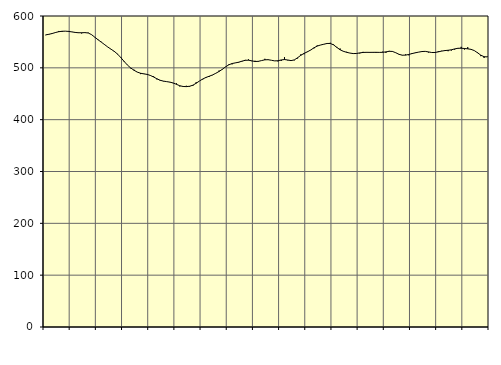
| Category | Piggar | Series 1 |
|---|---|---|
| nan | 563 | 563.58 |
| 87.0 | 565.1 | 564.72 |
| 87.0 | 565.5 | 566.22 |
| 87.0 | 567.5 | 568.09 |
| nan | 571.1 | 569.68 |
| 88.0 | 569.2 | 570.53 |
| 88.0 | 570.7 | 570.74 |
| 88.0 | 571.1 | 570.26 |
| nan | 569.1 | 569.36 |
| 89.0 | 568.6 | 568.34 |
| 89.0 | 568.3 | 567.7 |
| 89.0 | 566.3 | 567.71 |
| nan | 568.4 | 567.95 |
| 90.0 | 567.9 | 567.22 |
| 90.0 | 564.4 | 564.16 |
| 90.0 | 558.9 | 559.25 |
| nan | 553.6 | 554.25 |
| 91.0 | 550.2 | 549.6 |
| 91.0 | 545.5 | 544.87 |
| 91.0 | 540.1 | 540.17 |
| nan | 536.1 | 535.91 |
| 92.0 | 530.5 | 531.68 |
| 92.0 | 527 | 526.33 |
| 92.0 | 520.4 | 519.63 |
| nan | 511.3 | 512.28 |
| 93.0 | 505.6 | 505.3 |
| 93.0 | 499.1 | 499.74 |
| 93.0 | 496.4 | 495.35 |
| nan | 491.6 | 491.84 |
| 94.0 | 487.9 | 489.57 |
| 94.0 | 488.9 | 488.36 |
| 94.0 | 487.1 | 487.36 |
| nan | 484.8 | 485.33 |
| 95.0 | 483.7 | 482.29 |
| 95.0 | 477.7 | 478.91 |
| 95.0 | 475.1 | 476 |
| nan | 473.9 | 474.36 |
| 96.0 | 473.2 | 473.39 |
| 96.0 | 472.1 | 472.38 |
| 96.0 | 470.3 | 470.75 |
| nan | 470 | 468.12 |
| 97.0 | 464.1 | 465.45 |
| 97.0 | 463.6 | 464.02 |
| 97.0 | 465.4 | 463.77 |
| nan | 463.5 | 464.46 |
| 98.0 | 465.1 | 466.51 |
| 98.0 | 472.2 | 470.24 |
| 98.0 | 474.5 | 474.53 |
| nan | 477.5 | 478.4 |
| 99.0 | 482.3 | 481.45 |
| 99.0 | 482.5 | 483.8 |
| 99.0 | 485.9 | 486.26 |
| nan | 489.7 | 489.46 |
| 0.0 | 494.7 | 493 |
| 0.0 | 496.5 | 497.19 |
| 0.0 | 502.2 | 501.86 |
| nan | 506.8 | 505.86 |
| 1.0 | 506.8 | 508.33 |
| 1.0 | 509.3 | 509.55 |
| 1.0 | 510.1 | 510.87 |
| nan | 512.2 | 512.83 |
| 2.0 | 515.3 | 514.49 |
| 2.0 | 516.2 | 514.75 |
| 2.0 | 512.9 | 513.49 |
| nan | 513.6 | 512.19 |
| 3.0 | 511.7 | 512.54 |
| 3.0 | 513.9 | 514.02 |
| 3.0 | 517.4 | 515.45 |
| nan | 515.1 | 515.68 |
| 4.0 | 514.6 | 514.58 |
| 4.0 | 513.5 | 513.42 |
| 4.0 | 512.4 | 513.65 |
| nan | 513.4 | 515.19 |
| 5.0 | 520.5 | 515.99 |
| 5.0 | 514.4 | 515.09 |
| 5.0 | 513.7 | 513.91 |
| nan | 514.5 | 515.3 |
| 6.0 | 518.1 | 519.48 |
| 6.0 | 526 | 524.19 |
| 6.0 | 526.3 | 527.93 |
| nan | 531.6 | 530.85 |
| 7.0 | 534.1 | 534.42 |
| 7.0 | 537.5 | 538.6 |
| 7.0 | 543.2 | 541.97 |
| nan | 543.9 | 544.02 |
| 8.0 | 545.2 | 545.47 |
| 8.0 | 547.2 | 546.99 |
| 8.0 | 548.3 | 547.06 |
| nan | 545.2 | 544.32 |
| 9.0 | 540.4 | 539.35 |
| 9.0 | 537.2 | 534.84 |
| 9.0 | 531.4 | 531.88 |
| nan | 530.9 | 529.93 |
| 10.0 | 528.5 | 528.48 |
| 10.0 | 527.9 | 527.51 |
| 10.0 | 527.2 | 527.7 |
| nan | 527.8 | 528.81 |
| 11.0 | 530.8 | 529.69 |
| 11.0 | 529.2 | 529.9 |
| 11.0 | 529.1 | 529.84 |
| nan | 529.2 | 529.9 |
| 12.0 | 528.9 | 529.92 |
| 12.0 | 529.5 | 529.8 |
| 12.0 | 531.2 | 529.91 |
| nan | 528.9 | 530.79 |
| 13.0 | 532.7 | 531.89 |
| 13.0 | 531 | 531.63 |
| 13.0 | 529.4 | 529.13 |
| nan | 525.7 | 526.04 |
| 14.0 | 524 | 524.4 |
| 14.0 | 525.9 | 524.5 |
| 14.0 | 524.1 | 525.86 |
| nan | 528.6 | 527.55 |
| 15.0 | 529.6 | 528.99 |
| 15.0 | 530.2 | 530.31 |
| 15.0 | 532 | 531.43 |
| nan | 531.8 | 531.76 |
| 16.0 | 529.6 | 530.72 |
| 16.0 | 529.7 | 529.58 |
| 16.0 | 529.2 | 529.64 |
| nan | 532.2 | 530.8 |
| 17.0 | 532.8 | 532.24 |
| 17.0 | 534.3 | 533.27 |
| 17.0 | 532.1 | 533.92 |
| nan | 533.4 | 534.8 |
| 18.0 | 535.2 | 536.48 |
| 18.0 | 536.9 | 537.75 |
| 18.0 | 540.5 | 537.8 |
| nan | 535.3 | 537.32 |
| 19.0 | 539.8 | 536.64 |
| 19.0 | 535.7 | 535.67 |
| 19.0 | 533.4 | 533.3 |
| nan | 529.9 | 529.03 |
| 20.0 | 522.5 | 524.44 |
| 20.0 | 519.1 | 521.5 |
| 20.0 | 521.9 | 521.07 |